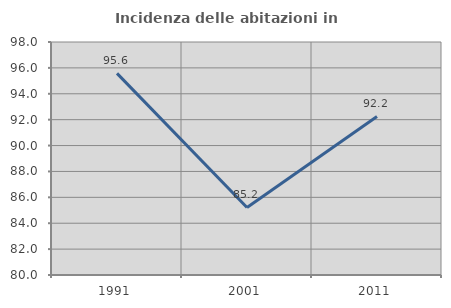
| Category | Incidenza delle abitazioni in proprietà  |
|---|---|
| 1991.0 | 95.575 |
| 2001.0 | 85.217 |
| 2011.0 | 92.248 |